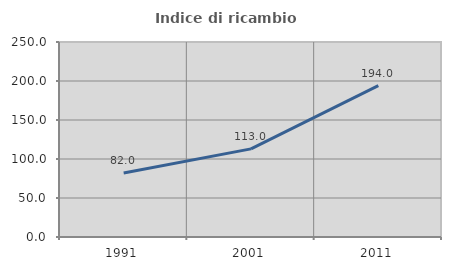
| Category | Indice di ricambio occupazionale  |
|---|---|
| 1991.0 | 81.988 |
| 2001.0 | 112.96 |
| 2011.0 | 193.974 |